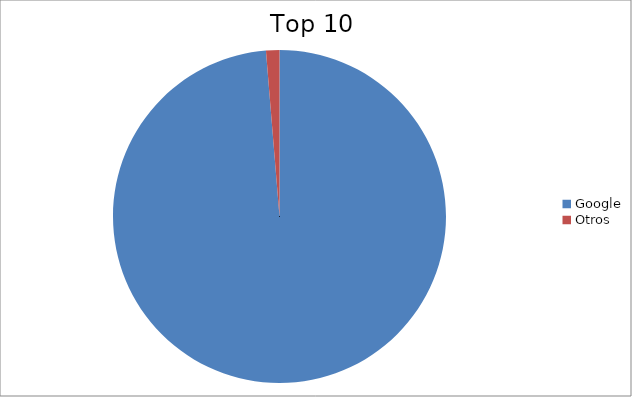
| Category | Series 0 |
|---|---|
| Google | 98.7 |
| Otros | 1.3 |